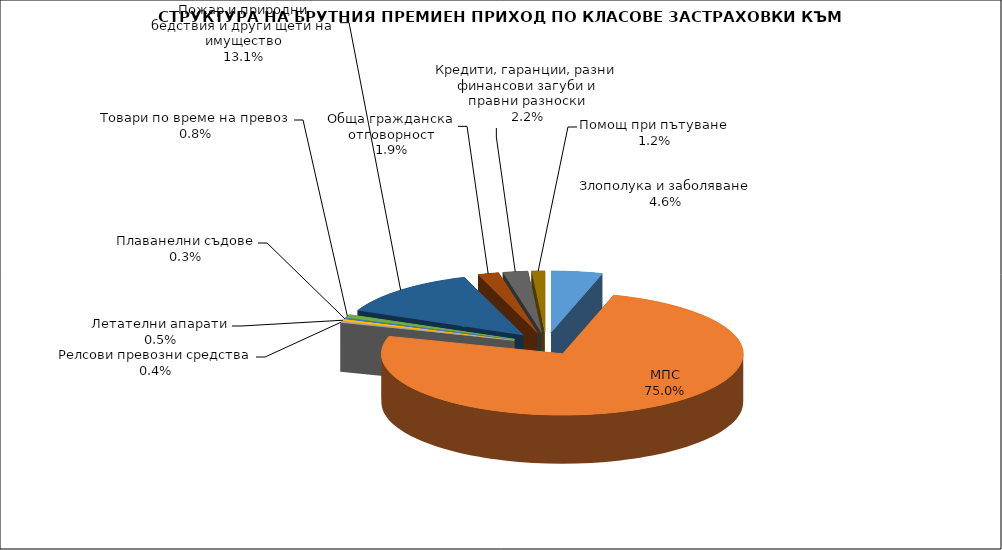
| Category | Злополука и заболяване |
|---|---|
| Злополука и заболяване | 0.046 |
| МПС | 0.75 |
| Релсови превозни средства | 0.004 |
| Летателни апарати | 0.005 |
| Плаванелни съдове | 0.003 |
| Товари по време на превоз | 0.008 |
| Пожар и природни бедствия и други щети на имущество | 0.131 |
| Обща гражданска отговорност | 0.019 |
| Кредити, гаранции, разни финансови загуби и правни разноски | 0.022 |
| Помощ при пътуване | 0.012 |